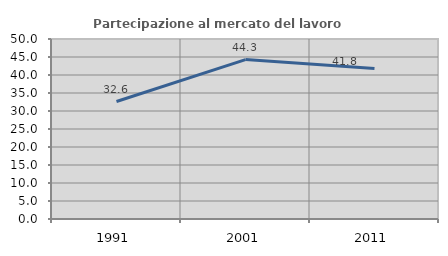
| Category | Partecipazione al mercato del lavoro  femminile |
|---|---|
| 1991.0 | 32.632 |
| 2001.0 | 44.273 |
| 2011.0 | 41.818 |